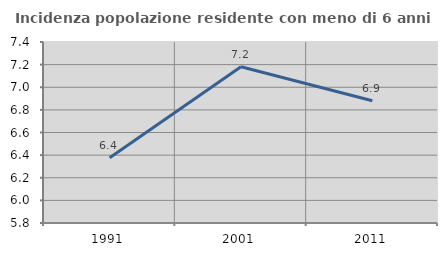
| Category | Incidenza popolazione residente con meno di 6 anni |
|---|---|
| 1991.0 | 6.376 |
| 2001.0 | 7.181 |
| 2011.0 | 6.881 |